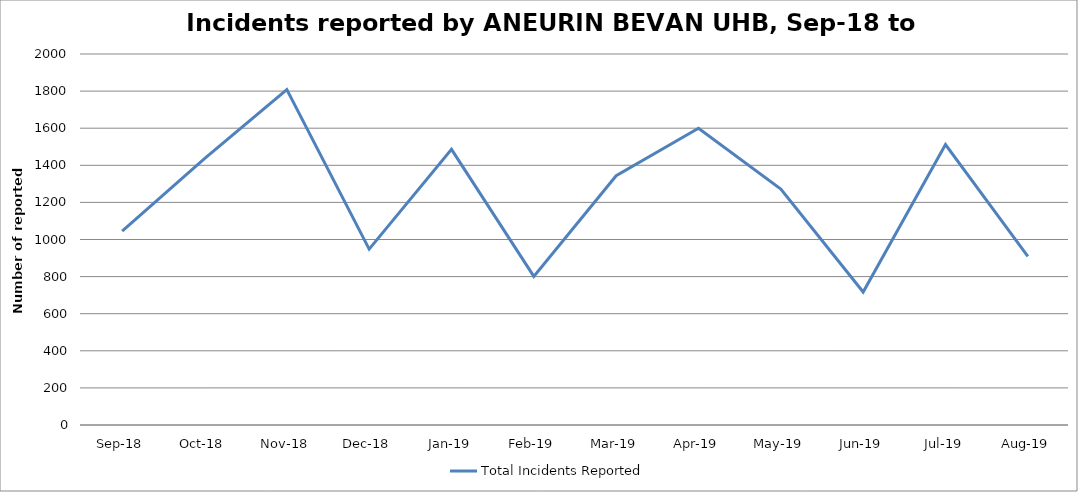
| Category | Total Incidents Reported |
|---|---|
| Sep-18 | 1045 |
| Oct-18 | 1436 |
| Nov-18 | 1808 |
| Dec-18 | 948 |
| Jan-19 | 1486 |
| Feb-19 | 801 |
| Mar-19 | 1344 |
| Apr-19 | 1600 |
| May-19 | 1272 |
| Jun-19 | 717 |
| Jul-19 | 1512 |
| Aug-19 | 909 |